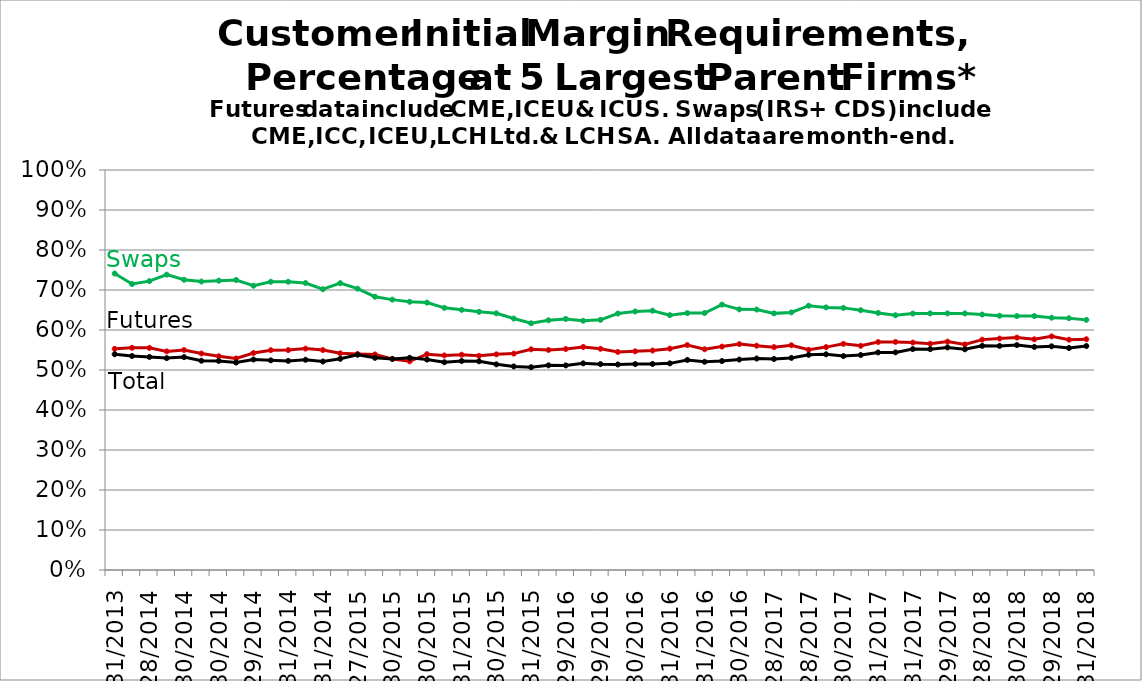
| Category | Futures | Swaps | Total | Series 8 | Series 9 |
|---|---|---|---|---|---|
| 2013-12-31 |  |  |  |  |  |
| nan |  |  |  |  |  |
| 2014-02-28 |  |  |  |  |  |
| nan |  |  |  |  |  |
| 2014-04-30 |  |  |  |  |  |
| nan |  |  |  |  |  |
| 2014-06-30 |  |  |  |  |  |
| nan |  |  |  |  |  |
| 2014-08-29 |  |  |  |  |  |
| nan |  |  |  |  |  |
| 2014-10-31 |  |  |  |  |  |
| nan |  |  |  |  |  |
| 2014-12-31 |  |  |  |  |  |
| nan |  |  |  |  |  |
| 2015-02-27 |  |  |  |  |  |
| nan |  |  |  |  |  |
| 2015-04-30 |  |  |  |  |  |
| nan |  |  |  |  |  |
| 2015-06-30 |  |  |  |  |  |
| nan |  |  |  |  |  |
| 2015-08-31 |  |  |  |  |  |
| nan |  |  |  |  |  |
| 2015-10-30 |  |  |  |  |  |
| nan |  |  |  |  |  |
| 2015-12-31 |  |  |  |  |  |
| nan |  |  |  |  |  |
| 2016-02-29 |  |  |  |  |  |
| nan |  |  |  |  |  |
| 2016-04-29 |  |  |  |  |  |
| nan |  |  |  |  |  |
| 2016-06-30 |  |  |  |  |  |
| nan |  |  |  |  |  |
| 2016-08-31 |  |  |  |  |  |
| nan |  |  |  |  |  |
| 2016-10-31 |  |  |  |  |  |
| nan |  |  |  |  |  |
| 2016-12-30 |  |  |  |  |  |
| nan |  |  |  |  |  |
| 2017-02-28 |  |  |  |  |  |
| nan |  |  |  |  |  |
| 2017-04-28 |  |  |  |  |  |
| nan |  |  |  |  |  |
| 2017-06-30 |  |  |  |  |  |
| nan |  |  |  |  |  |
| 2017-08-31 |  |  |  |  |  |
| nan |  |  |  |  |  |
| 2017-10-31 |  |  |  |  |  |
| nan |  |  |  |  |  |
| 2017-12-29 |  |  |  |  |  |
| nan |  |  |  |  |  |
| 2018-02-28 |  |  |  |  |  |
| nan |  |  |  |  |  |
| 2018-04-30 |  |  |  |  |  |
| nan |  |  |  |  |  |
| 2018-06-29 |  |  |  |  |  |
| nan |  |  |  |  |  |
| 2018-08-31 |  |  |  |  |  |